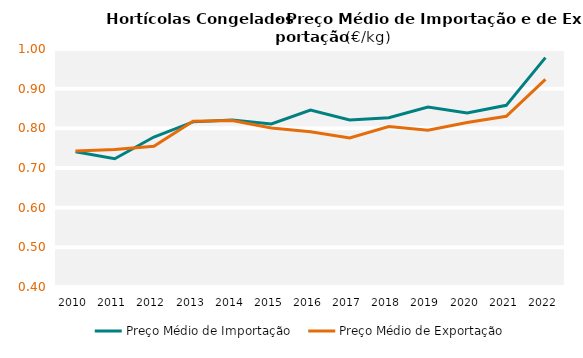
| Category | Preço Médio de Importação | Preço Médio de Exportação |
|---|---|---|
| 2010.0 | 0.741 | 0.743 |
| 2011.0 | 0.723 | 0.747 |
| 2012.0 | 0.778 | 0.755 |
| 2013.0 | 0.816 | 0.818 |
| 2014.0 | 0.821 | 0.82 |
| 2015.0 | 0.811 | 0.801 |
| 2016.0 | 0.846 | 0.792 |
| 2017.0 | 0.821 | 0.776 |
| 2018.0 | 0.827 | 0.804 |
| 2019.0 | 0.853 | 0.795 |
| 2020.0 | 0.839 | 0.815 |
| 2021.0 | 0.858 | 0.831 |
| 2022.0 | 0.978 | 0.923 |